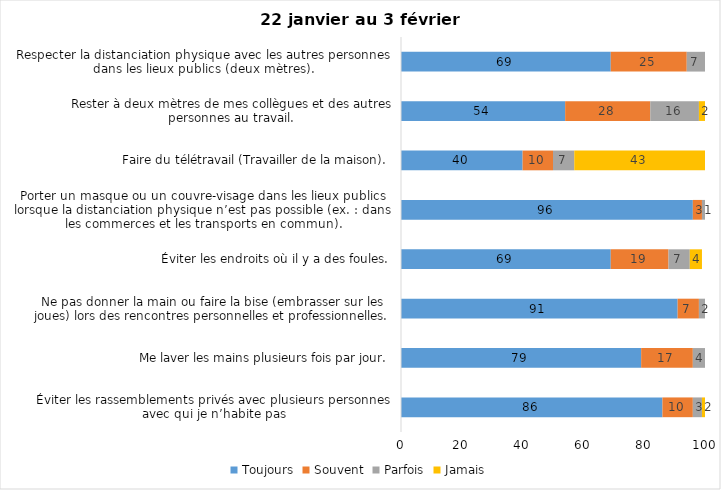
| Category | Toujours | Souvent | Parfois | Jamais |
|---|---|---|---|---|
| Éviter les rassemblements privés avec plusieurs personnes avec qui je n’habite pas | 86 | 10 | 3 | 2 |
| Me laver les mains plusieurs fois par jour. | 79 | 17 | 4 | 0 |
| Ne pas donner la main ou faire la bise (embrasser sur les joues) lors des rencontres personnelles et professionnelles. | 91 | 7 | 2 | 0 |
| Éviter les endroits où il y a des foules. | 69 | 19 | 7 | 4 |
| Porter un masque ou un couvre-visage dans les lieux publics lorsque la distanciation physique n’est pas possible (ex. : dans les commerces et les transports en commun). | 96 | 3 | 1 | 0 |
| Faire du télétravail (Travailler de la maison). | 40 | 10 | 7 | 43 |
| Rester à deux mètres de mes collègues et des autres personnes au travail. | 54 | 28 | 16 | 2 |
| Respecter la distanciation physique avec les autres personnes dans les lieux publics (deux mètres). | 69 | 25 | 7 | 0 |